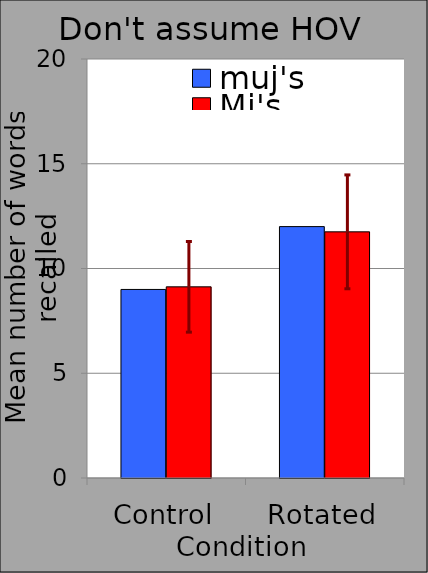
| Category | muj's | Mj's |
|---|---|---|
| Control | 9 | 9.125 |
| Rotated | 12 | 11.75 |